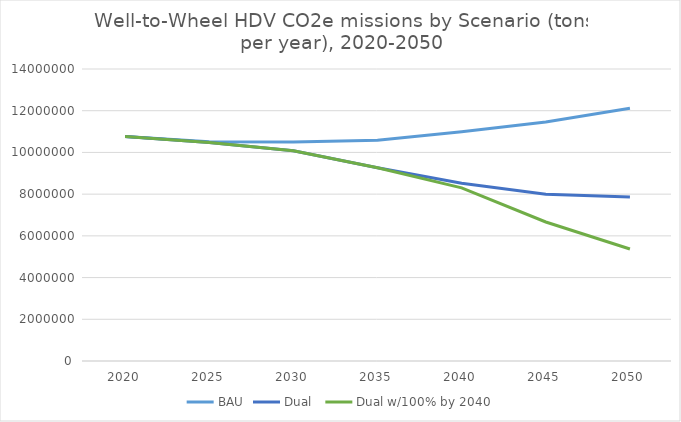
| Category | BAU | Dual  | Dual w/100% by 2040 |
|---|---|---|---|
| 2020.0 | 10759575.702 | 10759575.702 | 10759575.702 |
| 2025.0 | 10509518.883 | 10477568.697 | 10477568.697 |
| 2030.0 | 10497113.071 | 10080961.992 | 10080961.992 |
| 2035.0 | 10583645.958 | 9263702.169 | 9263702.169 |
| 2040.0 | 10989642.298 | 8523464.464 | 8302004.473 |
| 2045.0 | 11460658.579 | 7997269.165 | 6664127.886 |
| 2050.0 | 12118026.401 | 7860108.948 | 5370046.003 |